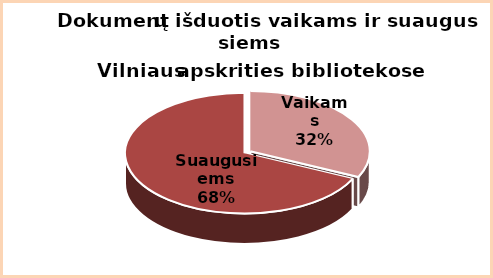
| Category | Series 0 |
|---|---|
| Vaikams | 0.32 |
| Suaugusiems | 0.68 |